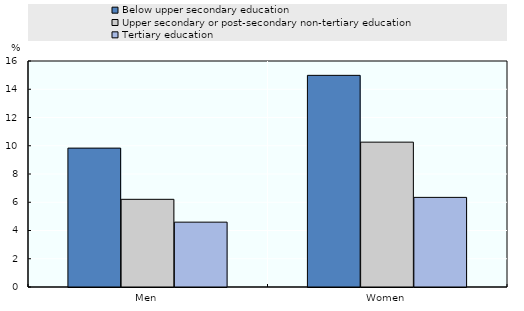
| Category | Below upper secondary education | Upper secondary or post-secondary non-tertiary education | Tertiary education |
|---|---|---|---|
| Men | 9.832 | 6.207 | 4.591 |
| Women | 14.984 | 10.255 | 6.345 |